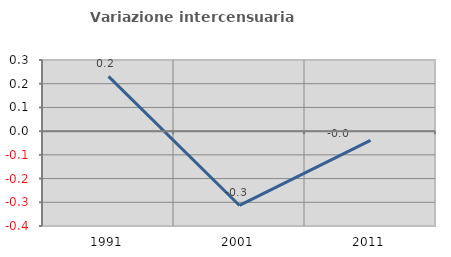
| Category | Variazione intercensuaria annua |
|---|---|
| 1991.0 | 0.231 |
| 2001.0 | -0.313 |
| 2011.0 | -0.039 |